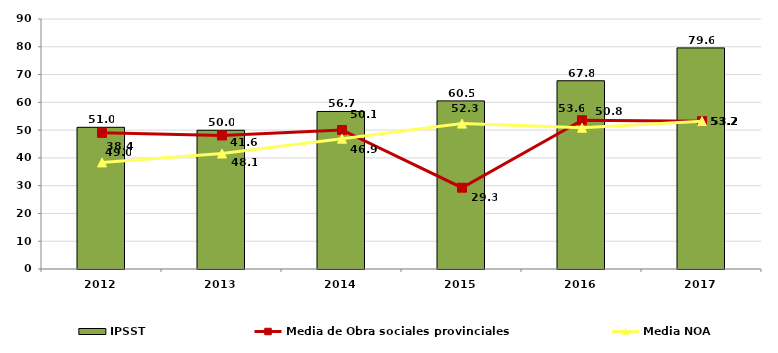
| Category | IPSST |
|---|---|
| 2012.0 | 51.01 |
| 2013.0 | 49.95 |
| 2014.0 | 56.71 |
| 2015.0 | 60.52 |
| 2016.0 | 67.77 |
| 2017.0 | 79.59 |